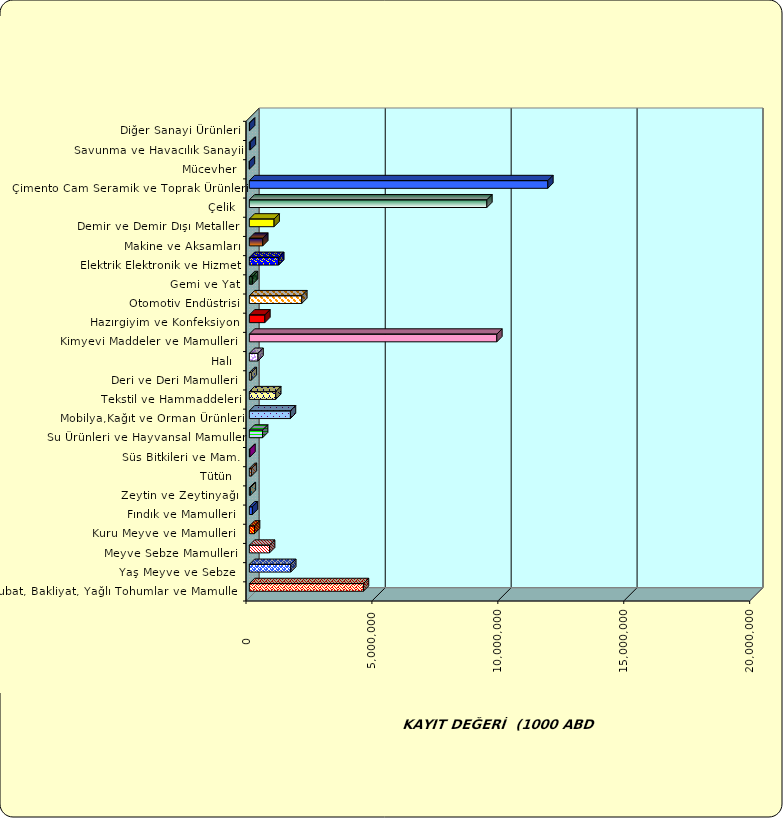
| Category | Series 0 |
|---|---|
|  Hububat, Bakliyat, Yağlı Tohumlar ve Mamulleri  | 4530567.206 |
|  Yaş Meyve ve Sebze   | 1644288.485 |
|  Meyve Sebze Mamulleri  | 802511.703 |
|  Kuru Meyve ve Mamulleri   | 205825.46 |
|  Fındık ve Mamulleri  | 120798.555 |
|  Zeytin ve Zeytinyağı  | 39625.978 |
|  Tütün  | 79710.956 |
|  Süs Bitkileri ve Mam. | 22760.61 |
|  Su Ürünleri ve Hayvansal Mamuller | 525542.314 |
|  Mobilya,Kağıt ve Orman Ürünleri | 1631136.186 |
|  Tekstil ve Hammaddeleri | 1047508.315 |
|  Deri ve Deri Mamulleri  | 77421.527 |
|  Halı  | 343863.06 |
|  Kimyevi Maddeler ve Mamulleri   | 9827022.874 |
|  Hazırgiyim ve Konfeksiyon  | 615401.812 |
|  Otomotiv Endüstrisi | 2082875.106 |
|  Gemi ve Yat | 123052.747 |
|  Elektrik Elektronik ve Hizmet | 1166725.586 |
|  Makine ve Aksamları | 532436.045 |
|  Demir ve Demir Dışı Metaller  | 981945.867 |
|  Çelik | 9431477.378 |
|  Çimento Cam Seramik ve Toprak Ürünleri | 11852560.226 |
|  Mücevher | 1522.826 |
|  Savunma ve Havacılık Sanayii | 39896.496 |
|  Diğer Sanayi Ürünleri | 9472.553 |